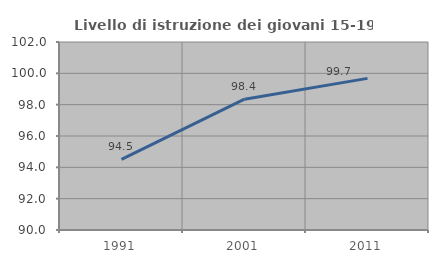
| Category | Livello di istruzione dei giovani 15-19 anni |
|---|---|
| 1991.0 | 94.508 |
| 2001.0 | 98.352 |
| 2011.0 | 99.678 |